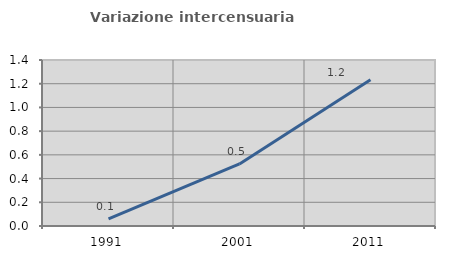
| Category | Variazione intercensuaria annua |
|---|---|
| 1991.0 | 0.06 |
| 2001.0 | 0.524 |
| 2011.0 | 1.234 |